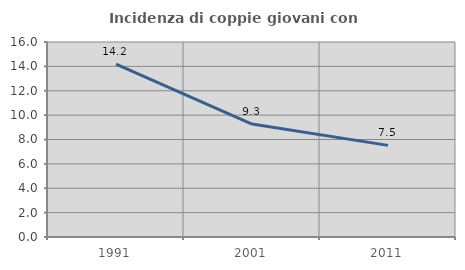
| Category | Incidenza di coppie giovani con figli |
|---|---|
| 1991.0 | 14.182 |
| 2001.0 | 9.268 |
| 2011.0 | 7.519 |